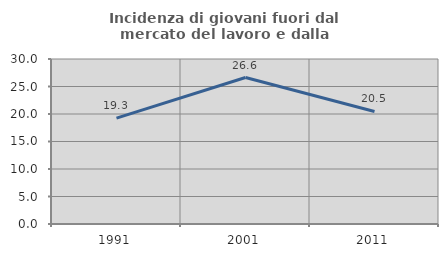
| Category | Incidenza di giovani fuori dal mercato del lavoro e dalla formazione  |
|---|---|
| 1991.0 | 19.252 |
| 2001.0 | 26.628 |
| 2011.0 | 20.46 |